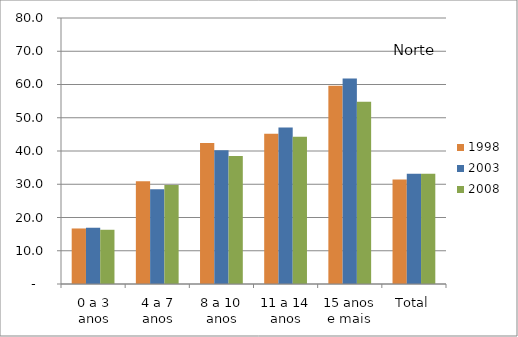
| Category | 1998 | 2003 | 2008 |
|---|---|---|---|
| 0 a 3 anos | 16.7 | 16.92 | 16.31 |
| 4 a 7 anos | 30.89 | 28.53 | 29.78 |
| 8 a 10 anos | 42.42 | 40.26 | 38.52 |
| 11 a 14 anos | 45.22 | 47.09 | 44.26 |
| 15 anos e mais | 59.63 | 61.8 | 54.83 |
| Total | 31.41 | 33.15 | 33.16 |